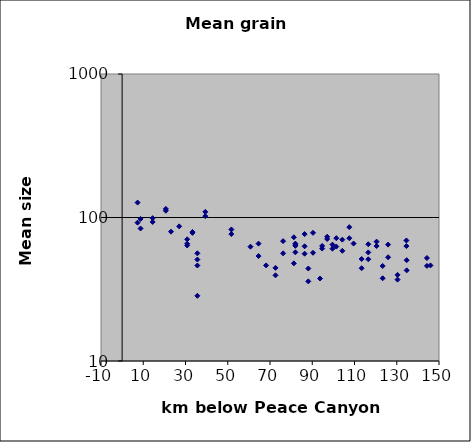
| Category | Series 0 |
|---|---|
| 7.319999999999936 | 127.04 |
| 7.319999999999936 | 92.06 |
| 8.720000000000027 | 83.82 |
| 8.720000000000027 | 97.72 |
| 14.43999999999994 | 93.06 |
| 14.43999999999994 | 98.96 |
| 20.700000000000045 | 114.84 |
| 20.700000000000045 | 111.46 |
| 23.139999999999986 | 79.67 |
| 27.0 | 86.74 |
| 30.799999999999955 | 65.69 |
| 30.799999999999955 | 70.46 |
| 30.799999999999955 | 63.81 |
| 33.309999999999945 | 79.28 |
| 33.309999999999945 | 78.14 |
| 35.610000000000014 | 50.94 |
| 35.610000000000014 | 46.28 |
| 35.610000000000014 | 28.47 |
| 35.610000000000014 | 56.26 |
| 39.379999999999995 | 109.46 |
| 39.379999999999995 | 102.22 |
| 51.710000000000036 | 76.64 |
| 51.710000000000036 | 82.52 |
| 60.75 | 62.6 |
| 64.58000000000004 | 65.76 |
| 64.58000000000004 | 53.86 |
| 68.14999999999998 | 46.39 |
| 72.60000000000002 | 44.58 |
| 72.60000000000002 | 39.56 |
| 76.20000000000005 | 68.45 |
| 76.20000000000005 | 56.26 |
| 81.29999999999995 | 47.9 |
| 81.29999999999995 | 72.81 |
| 82.00999999999999 | 64.3 |
| 82.00999999999999 | 57.2 |
| 82.00999999999999 | 63.44 |
| 82.00999999999999 | 65.78 |
| 86.38999999999999 | 55.94 |
| 86.38999999999999 | 76.64 |
| 86.38999999999999 | 62.98 |
| 88.13 | 44.1 |
| 88.13 | 35.9 |
| 90.36000000000001 | 78.24 |
| 90.36000000000001 | 56.76 |
| 93.67999999999995 | 37.57 |
| 94.68999999999994 | 60.74 |
| 94.68999999999994 | 63.38 |
| 97.06999999999994 | 70.8 |
| 97.06999999999994 | 73.44 |
| 99.56999999999994 | 60.64 |
| 99.56999999999994 | 64.72 |
| 101.38999999999999 | 71.8 |
| 101.38999999999999 | 62.7 |
| 104.24000000000001 | 70.08 |
| 104.24000000000001 | 58.62 |
| 107.53999999999996 | 85.64 |
| 107.53999999999996 | 71.7 |
| 109.54999999999995 | 65.85 |
| 113.38 | 44.32 |
| 113.38 | 51.38 |
| 116.51999999999998 | 57.06 |
| 116.51999999999998 | 51.16 |
| 116.51999999999998 | 65.1 |
| 120.47000000000003 | 67.9 |
| 120.47000000000003 | 63.28 |
| 123.34000000000003 | 45.94 |
| 123.34000000000003 | 37.7 |
| 125.89999999999998 | 52.84 |
| 125.89999999999998 | 64.74 |
| 130.37 | 39.82 |
| 130.37 | 36.92 |
| 134.56999999999994 | 63.2 |
| 134.56999999999994 | 69.16 |
| 134.70000000000005 | 50.4 |
| 134.70000000000005 | 42.82 |
| 144.28999999999996 | 46 |
| 144.28999999999996 | 52.16 |
| 145.95000000000005 | 46.34 |